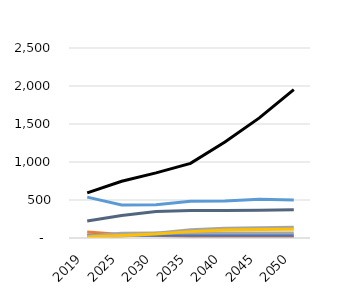
| Category | liquids | natural gas | coal | nuclear | hydro | other | wind | solar |
|---|---|---|---|---|---|---|---|---|
| 2019.0 | 77.92 | 538.19 | 593.2 | 37.21 | 224.79 | 26.84 | 9.54 | 11.95 |
| 2025.0 | 47.72 | 435.38 | 746.44 | 37.27 | 296.98 | 61.18 | 22.11 | 32.14 |
| 2030.0 | 31.63 | 438.36 | 856.97 | 37.27 | 349.99 | 65.64 | 61.53 | 52.26 |
| 2035.0 | 20.73 | 483.49 | 982.21 | 37.27 | 361.93 | 66.3 | 108.47 | 83.86 |
| 2040.0 | 13.36 | 486.65 | 1264.28 | 37.27 | 363.03 | 65.88 | 129.1 | 105.24 |
| 2045.0 | 8.36 | 508.93 | 1579.91 | 37.27 | 365.4 | 65.99 | 135.71 | 110.33 |
| 2050.0 | 5.1 | 499.2 | 1953.38 | 37.27 | 370.19 | 66.1 | 141.48 | 115.49 |